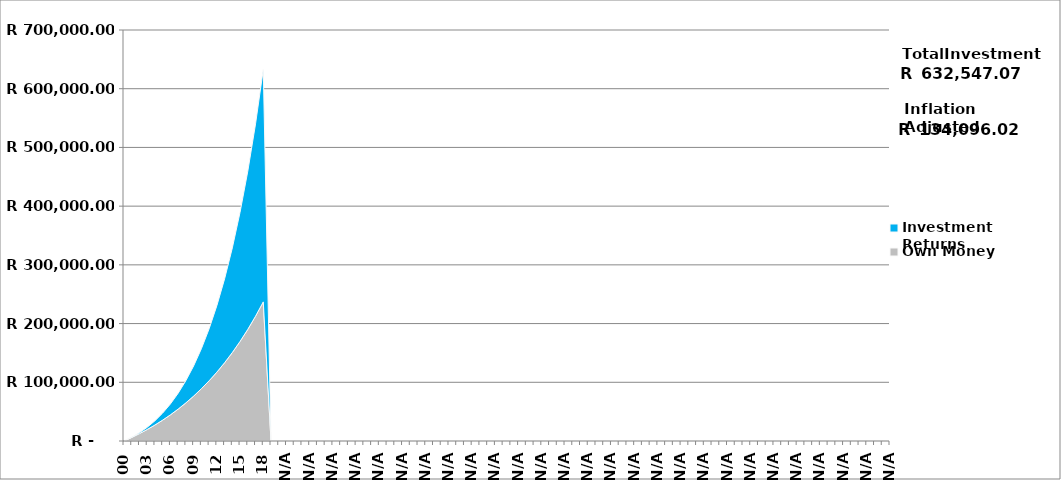
| Category | Own Money | Investment Returns |
|---|---|---|
| 2000-01-01 | 0 | 0 |
| 2001-01-01 | 6000 | 383.249 |
| 2002-01-01 | 12540 | 1566.98 |
| 2003-01-01 | 19619.55 | 3764.206 |
| 2004-01-01 | 27287.21 | 7169.09 |
| 2005-01-01 | 35595.908 | 12005.623 |
| 2006-01-01 | 44603.34 | 18531.795 |
| 2007-01-01 | 54372.391 | 27044.308 |
| 2008-01-01 | 64971.606 | 37883.926 |
| 2009-01-01 | 76475.7 | 51441.519 |
| 2010-01-01 | 88966.113 | 68164.907 |
| 2011-01-01 | 102531.614 | 88566.601 |
| 2012-01-01 | 117268.959 | 113232.546 |
| 2013-01-01 | 133283.615 | 142832.01 |
| 2014-01-01 | 150690.541 | 178128.754 |
| 2015-01-01 | 169615.039 | 219993.646 |
| 2016-01-01 | 190193.693 | 269418.907 |
| 2017-01-01 | 212575.375 | 327534.188 |
| 2018-01-01 | 236922.359 | 395624.713 |
| #N/A | 0 | 0 |
| #N/A | 0 | 0 |
| #N/A | 0 | 0 |
| #N/A | 0 | 0 |
| #N/A | 0 | 0 |
| #N/A | 0 | 0 |
| #N/A | 0 | 0 |
| #N/A | 0 | 0 |
| #N/A | 0 | 0 |
| #N/A | 0 | 0 |
| #N/A | 0 | 0 |
| #N/A | 0 | 0 |
| #N/A | 0 | 0 |
| #N/A | 0 | 0 |
| #N/A | 0 | 0 |
| #N/A | 0 | 0 |
| #N/A | 0 | 0 |
| #N/A | 0 | 0 |
| #N/A | 0 | 0 |
| #N/A | 0 | 0 |
| #N/A | 0 | 0 |
| #N/A | 0 | 0 |
| #N/A | 0 | 0 |
| #N/A | 0 | 0 |
| #N/A | 0 | 0 |
| #N/A | 0 | 0 |
| #N/A | 0 | 0 |
| #N/A | 0 | 0 |
| #N/A | 0 | 0 |
| #N/A | 0 | 0 |
| #N/A | 0 | 0 |
| #N/A | 0 | 0 |
| #N/A | 0 | 0 |
| #N/A | 0 | 0 |
| #N/A | 0 | 0 |
| #N/A | 0 | 0 |
| #N/A | 0 | 0 |
| #N/A | 0 | 0 |
| #N/A | 0 | 0 |
| #N/A | 0 | 0 |
| #N/A | 0 | 0 |
| #N/A | 0 | 0 |
| #N/A | 0 | 0 |
| #N/A | 0 | 0 |
| #N/A | 0 | 0 |
| #N/A | 0 | 0 |
| #N/A | 0 | 0 |
| #N/A | 0 | 0 |
| #N/A | 0 | 0 |
| #N/A | 0 | 0 |
| #N/A | 0 | 0 |
| #N/A | 0 | 0 |
| #N/A | 0 | 0 |
| #N/A | 0 | 0 |
| #N/A | 0 | 0 |
| #N/A | 0 | 0 |
| #N/A | 0 | 0 |
| #N/A | 0 | 0 |
| #N/A | 0 | 0 |
| #N/A | 0 | 0 |
| #N/A | 0 | 0 |
| #N/A | 0 | 0 |
| #N/A | 0 | 0 |
| #N/A | 0 | 0 |
| #N/A | 0 | 0 |
| #N/A | 0 | 0 |
| #N/A | 0 | 0 |
| #N/A | 0 | 0 |
| #N/A | 0 | 0 |
| #N/A | 0 | 0 |
| #N/A | 0 | 0 |
| #N/A | 0 | 0 |
| #N/A | 0 | 0 |
| #N/A | 0 | 0 |
| #N/A | 0 | 0 |
| #N/A | 0 | 0 |
| #N/A | 0 | 0 |
| #N/A | 0 | 0 |
| #N/A | 0 | 0 |
| #N/A | 0 | 0 |
| #N/A | 0 | 0 |